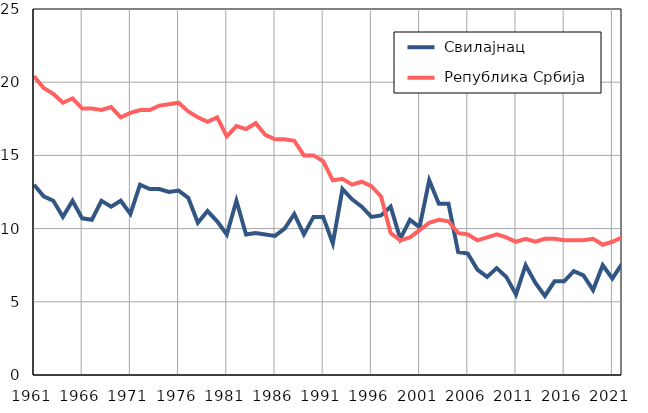
| Category |  Свилајнац |  Република Србија |
|---|---|---|
| 1961.0 | 13 | 20.4 |
| 1962.0 | 12.2 | 19.6 |
| 1963.0 | 11.9 | 19.2 |
| 1964.0 | 10.8 | 18.6 |
| 1965.0 | 11.9 | 18.9 |
| 1966.0 | 10.7 | 18.2 |
| 1967.0 | 10.6 | 18.2 |
| 1968.0 | 11.9 | 18.1 |
| 1969.0 | 11.5 | 18.3 |
| 1970.0 | 11.9 | 17.6 |
| 1971.0 | 11 | 17.9 |
| 1972.0 | 13 | 18.1 |
| 1973.0 | 12.7 | 18.1 |
| 1974.0 | 12.7 | 18.4 |
| 1975.0 | 12.5 | 18.5 |
| 1976.0 | 12.6 | 18.6 |
| 1977.0 | 12.1 | 18 |
| 1978.0 | 10.4 | 17.6 |
| 1979.0 | 11.2 | 17.3 |
| 1980.0 | 10.5 | 17.6 |
| 1981.0 | 9.6 | 16.3 |
| 1982.0 | 11.9 | 17 |
| 1983.0 | 9.6 | 16.8 |
| 1984.0 | 9.7 | 17.2 |
| 1985.0 | 9.6 | 16.4 |
| 1986.0 | 9.5 | 16.1 |
| 1987.0 | 10 | 16.1 |
| 1988.0 | 11 | 16 |
| 1989.0 | 9.6 | 15 |
| 1990.0 | 10.8 | 15 |
| 1991.0 | 10.8 | 14.6 |
| 1992.0 | 9 | 13.3 |
| 1993.0 | 12.7 | 13.4 |
| 1994.0 | 12 | 13 |
| 1995.0 | 11.5 | 13.2 |
| 1996.0 | 10.8 | 12.9 |
| 1997.0 | 10.9 | 12.2 |
| 1998.0 | 11.5 | 9.7 |
| 1999.0 | 9.3 | 9.2 |
| 2000.0 | 10.6 | 9.4 |
| 2001.0 | 10.1 | 9.9 |
| 2002.0 | 13.3 | 10.4 |
| 2003.0 | 11.7 | 10.6 |
| 2004.0 | 11.7 | 10.5 |
| 2005.0 | 8.4 | 9.7 |
| 2006.0 | 8.3 | 9.6 |
| 2007.0 | 7.2 | 9.2 |
| 2008.0 | 6.7 | 9.4 |
| 2009.0 | 7.3 | 9.6 |
| 2010.0 | 6.7 | 9.4 |
| 2011.0 | 5.5 | 9.1 |
| 2012.0 | 7.5 | 9.3 |
| 2013.0 | 6.3 | 9.1 |
| 2014.0 | 5.4 | 9.3 |
| 2015.0 | 6.4 | 9.3 |
| 2016.0 | 6.4 | 9.2 |
| 2017.0 | 7.1 | 9.2 |
| 2018.0 | 6.8 | 9.2 |
| 2019.0 | 5.8 | 9.3 |
| 2020.0 | 7.5 | 8.9 |
| 2021.0 | 6.6 | 9.1 |
| 2022.0 | 7.6 | 9.4 |